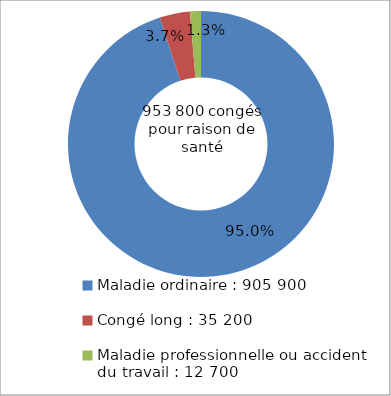
| Category | Series 0 |
|---|---|
| Maladie ordinaire : 905 900 | 0.95 |
| Congé long : 35 200 | 0.037 |
| Maladie professionnelle ou accident du travail : 12 700 | 0.013 |